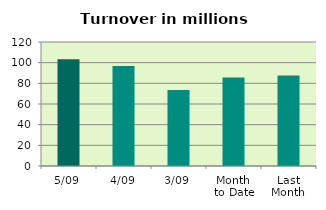
| Category | Series 0 |
|---|---|
| 5/09 | 103.403 |
| 4/09 | 96.885 |
| 3/09 | 73.627 |
| Month 
to Date | 85.747 |
| Last
Month | 87.619 |